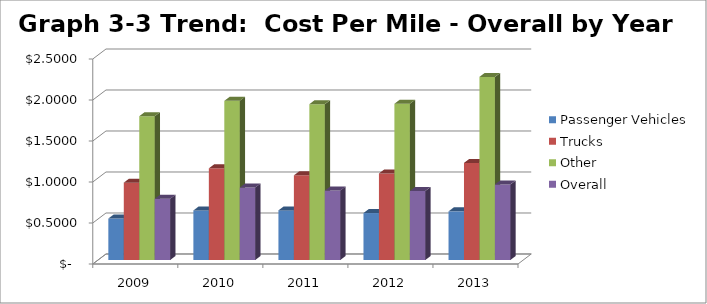
| Category | Passenger Vehicles | Trucks | Other | Overall |
|---|---|---|---|---|
| 2009.0 | 0.506 | 0.944 | 1.754 | 0.746 |
| 2010.0 | 0.604 | 1.118 | 1.941 | 0.884 |
| 2011.0 | 0.605 | 1.032 | 1.901 | 0.846 |
| 2012.0 | 0.572 | 1.056 | 1.906 | 0.842 |
| 2013.0 | 0.593 | 1.184 | 2.233 | 0.922 |